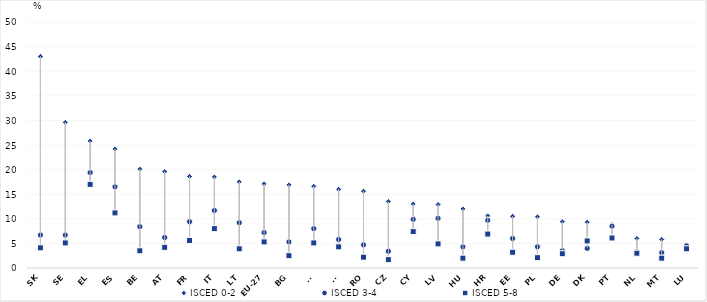
| Category | ISCED 0-2 | ISCED 3-4 | ISCED 5-8 |
|---|---|---|---|
| SK | 43 | 6.7 | 4.1 |
| SE | 29.6 | 6.7 | 5.1 |
| EL | 25.8 | 19.4 | 17 |
| ES | 24.2 | 16.5 | 11.2 |
| BE | 20.1 | 8.4 | 3.5 |
| AT | 19.6 | 6.2 | 4.2 |
| FR | 18.6 | 9.4 | 5.6 |
| IT | 18.5 | 11.7 | 8 |
| LT | 17.5 | 9.2 | 3.9 |
| EU-27 | 17.1 | 7.2 | 5.3 |
| BG | 16.9 | 5.3 | 2.5 |
| FI | 16.6 | 8 | 5.1 |
| SI | 16 | 5.8 | 4.3 |
| RO | 15.6 | 4.7 | 2.2 |
| CZ | 13.5 | 3.4 | 1.7 |
| CY | 13 | 9.9 | 7.4 |
| LV | 12.9 | 10.1 | 4.9 |
| HU | 12 | 4.3 | 2 |
| HR | 10.6 | 9.7 | 6.9 |
| EE | 10.5 | 6 | 3.2 |
| PL | 10.4 | 4.3 | 2.1 |
| DE | 9.4 | 3.5 | 2.9 |
| DK | 9.3 | 4 | 5.5 |
| PT | 8.8 | 8.5 | 6.1 |
| NL | 6 | 3.3 | 3 |
| MT | 5.8 | 3.1 | 2 |
| LU | 4.6 | 4.5 | 3.9 |